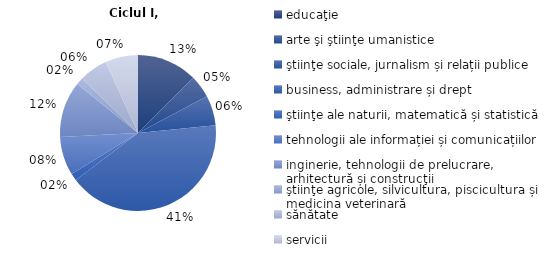
| Category | 2020/21 |
|---|---|
| educaţie | 12.5 |
| arte şi ştiinţe umanistice | 4.7 |
| ştiinţe sociale, jurnalism și relații publice   | 6.2 |
| business, administrare și drept | 41.3 |
| ştiinţe ale naturii, matematică și statistică | 1.5 |
| tehnologii ale informației și comunicațiilor  | 8 |
| inginerie, tehnologii de prelucrare, arhitectură și construcţii | 11.6 |
| ştiinţe agricole, silvicultura, piscicultura și  medicina veterinară | 1.5 |
| sănătate | 5.9 |
| servicii | 6.8 |